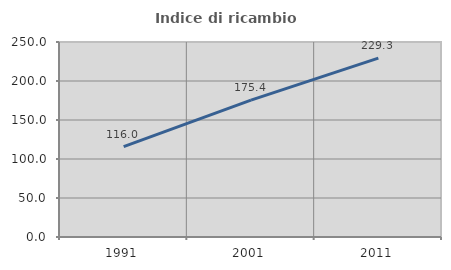
| Category | Indice di ricambio occupazionale  |
|---|---|
| 1991.0 | 115.976 |
| 2001.0 | 175.439 |
| 2011.0 | 229.268 |